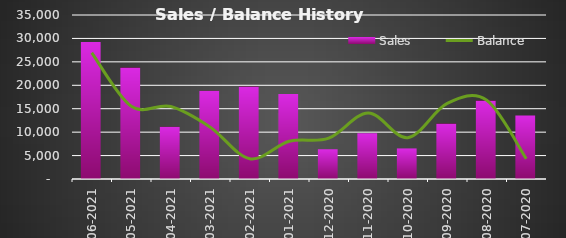
| Category |  Sales  |
|---|---|
| 2021-06-30 | 29220 |
| 2021-05-31 | 23790 |
| 2021-04-30 | 11156 |
| 2021-03-31 | 18830 |
| 2021-02-28 | 19730 |
| 2021-01-31 | 18124 |
| 2020-12-31 | 6352 |
| 2020-11-30 | 9775 |
| 2020-10-31 | 6525 |
| 2020-09-30 | 11820 |
| 2020-08-31 | 16750 |
| 2020-07-31 | 13570 |